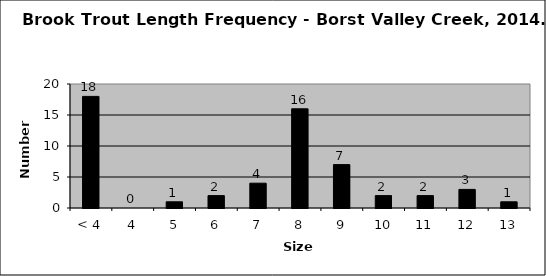
| Category | Series 0 |
|---|---|
| < 4 | 18 |
| 4 | 0 |
| 5 | 1 |
| 6 | 2 |
| 7 | 4 |
| 8 | 16 |
| 9 | 7 |
| 10 | 2 |
| 11 | 2 |
| 12 | 3 |
| 13 | 1 |